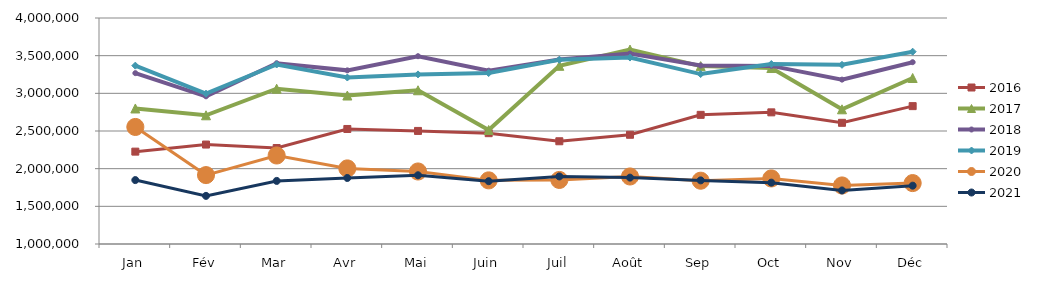
| Category | 2015 | 2016 | 2017 | 2018 | 2019 | 2020 | 2021 |
|---|---|---|---|---|---|---|---|
| Jan |  | 2226093.309 | 2798915.391 | 3268127.156 | 3367510.542 | 2553542.465 | 1848435.265 |
| Fév |  | 2320135.002 | 2708507.11 | 2960518.709 | 2995707.194 | 1914783.421 | 1639009.953 |
| Mar |  | 2274111.99 | 3061215.361 | 3399788.443 | 3382590.899 | 2175089.683 | 1837369.769 |
| Avr |  | 2526794.87 | 2970911.094 | 3304906.324 | 3209954.832 | 2003293.895 | 1876404.979 |
| Mai |  | 2500868.782 | 3040805.262 | 3492911.082 | 3251146.092 | 1962510.702 | 1912345.285 |
| Juin |  | 2471115.702 | 2513480.318 | 3300924.802 | 3269085.474 | 1844603.728 | 1833702.622 |
| Juil |  | 2363852.978 | 3365511.031 | 3448603.566 | 3445052.713 | 1850370.172 | 1896825.197 |
| Août |  | 2449927.953 | 3580436.797 | 3528173.012 | 3474993.525 | 1896365.756 | 1881267.945 |
| Sep |  | 2714390.875 | 3361524.335 | 3369626.193 | 3255644.054 | 1840205.182 | 1844525.749 |
| Oct |  | 2747632.929 | 3335934.501 | 3364260.879 | 3388972.2 | 1870450.237 | 1814485.706 |
| Nov |  | 2608583.302 | 2787992.168 | 3181888.576 | 3378477.919 | 1777011.858 | 1710700.553 |
| Déc |  | 2830164.13 | 3203732.398 | 3413454.996 | 3552894.26 | 1808480.012 | 1774263.924 |